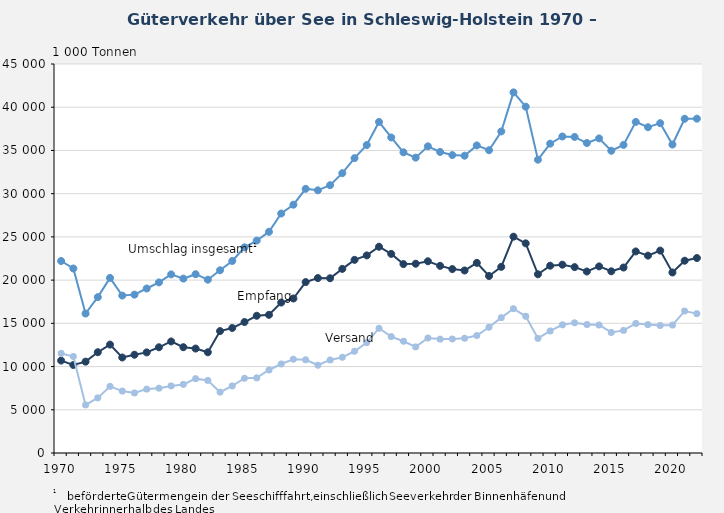
| Category | Umschlag insgesamt1 | Empfang | Versand |
|---|---|---|---|
| 1970.0 | 22209 | 10692 | 11517 |
| 1971.0 | 21343 | 10182 | 11161 |
| 1972.0 | 16132 | 10568 | 5564 |
| 1973.0 | 18029 | 11659 | 6370 |
| 1974.0 | 20254 | 12543 | 7711 |
| 1975.0 | 18212 | 11049 | 7163 |
| 1976.0 | 18320 | 11365 | 6955 |
| 1977.0 | 19029 | 11637 | 7392 |
| 1978.0 | 19731 | 12229 | 7502 |
| 1979.0 | 20663 | 12904 | 7759 |
| 1980.0 | 20173 | 12240 | 7933 |
| 1981.0 | 20685 | 12083 | 8602 |
| 1982.0 | 20049 | 11651 | 8398 |
| 1983.0 | 21138 | 14103 | 7035 |
| 1984.0 | 22216 | 14463 | 7753 |
| 1985.0 | 23795 | 15150 | 8645 |
| 1986.0 | 24575 | 15876 | 8699 |
| 1987.0 | 25589 | 15985 | 9604 |
| 1988.0 | 27703 | 17405 | 10298 |
| 1989.0 | 28722 | 17875 | 10847 |
| 1990.0 | 30558 | 19771 | 10787 |
| 1991.0 | 30385 | 20237 | 10148 |
| 1992.0 | 30980 | 20215 | 10765 |
| 1993.0 | 32368 | 21298 | 11070 |
| 1994.0 | 34111 | 22342 | 11769 |
| 1995.0 | 35626 | 22856 | 12770 |
| 1996.0 | 38297 | 23862 | 14435 |
| 1997.0 | 36501 | 23033 | 13468 |
| 1998.0 | 34783 | 21855 | 12929 |
| 1999.0 | 34170 | 21895 | 12275 |
| 2000.0 | 35476 | 22178 | 13298 |
| 2001.0 | 34823 | 21649 | 13174 |
| 2002.0 | 34465 | 21278 | 13187 |
| 2003.0 | 34390 | 21114 | 13277 |
| 2004.0 | 35581 | 21995 | 13585 |
| 2005.0 | 35021 | 20478 | 14543 |
| 2006.0 | 37196 | 21535 | 15661 |
| 2007.0 | 41718 | 25022 | 16695 |
| 2008.0 | 40064 | 24252 | 15812 |
| 2009.0 | 33928 | 20674 | 13254 |
| 2010.0 | 35786 | 21667 | 14120 |
| 2011.0 | 36614 | 21784 | 14830 |
| 2012.0 | 36563 | 21505 | 15059 |
| 2013.0 | 35856 | 20994 | 14862 |
| 2014.0 | 36393 | 21586 | 14807 |
| 2015.0 | 34963 | 21019 | 13944 |
| 2016.0 | 35642 | 21457 | 14185 |
| 2017.0 | 38302 | 23318 | 14984 |
| 2018.0 | 37688 | 22834 | 14854 |
| 2019.0 | 38156 | 23413 | 14743 |
| 2020.0 | 35685 | 20884 | 14801 |
| 2021.0 | 38663 | 22243 | 16420 |
| 2022.0 | 38675 | 22553 | 16122 |